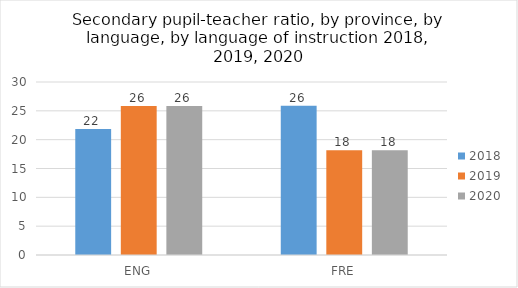
| Category | 2018 | 2019 | 2020 |
|---|---|---|---|
| ENG | 21.866 | 25.853 | 25.853 |
| FRE | 25.867 | 18.18 | 18.18 |